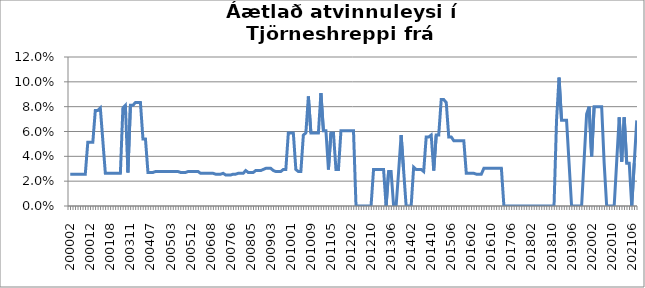
| Category | Series 0 |
|---|---|
| 200002 | 0.026 |
| 200003 | 0.026 |
| 200004 | 0.026 |
| 200005 | 0.026 |
| 200008 | 0.026 |
| 200009 | 0.026 |
| 200010 | 0.026 |
| 200011 | 0.051 |
| 200012 | 0.051 |
| 200101 | 0.051 |
| 200102 | 0.077 |
| 200103 | 0.077 |
| 200104 | 0.079 |
| 200105 | 0.053 |
| 200106 | 0.026 |
| 200107 | 0.026 |
| 200108 | 0.026 |
| 200110 | 0.026 |
| 200111 | 0.026 |
| 200201 | 0.026 |
| 200202 | 0.026 |
| 200302 | 0.079 |
| 200303 | 0.081 |
| 200307 | 0.027 |
| 200311 | 0.081 |
| 200312 | 0.081 |
| 200401 | 0.083 |
| 200402 | 0.083 |
| 200403 | 0.083 |
| 200404 | 0.054 |
| 200405 | 0.054 |
| 200406 | 0.027 |
| 200407 | 0.027 |
| 200408 | 0.027 |
| 200409 | 0.028 |
| 200410 | 0.028 |
| 200411 | 0.028 |
| 200412 | 0.028 |
| 200501 | 0.028 |
| 200502 | 0.028 |
| 200503 | 0.028 |
| 200504 | 0.028 |
| 200505 | 0.028 |
| 200506 | 0.028 |
| 200507 | 0.027 |
| 200508 | 0.027 |
| 200509 | 0.027 |
| 200510 | 0.028 |
| 200512 | 0.028 |
| 200601 | 0.028 |
| 200602 | 0.028 |
| 200603 | 0.028 |
| 200604 | 0.026 |
| 200605 | 0.026 |
| 200606 | 0.026 |
| 200607 | 0.026 |
| 200608 | 0.026 |
| 200609 | 0.026 |
| 200610 | 0.026 |
| 200611 | 0.026 |
| 200612 | 0.026 |
| 200703 | 0.026 |
| 200704 | 0.025 |
| 200705 | 0.025 |
| 200706 | 0.025 |
| 200707 | 0.026 |
| 200709 | 0.026 |
| 200710 | 0.026 |
| 200711 | 0.026 |
| 200801 | 0.026 |
| 200803 | 0.029 |
| 200804 | 0.027 |
| 200805 | 0.027 |
| 200806 | 0.027 |
| 200807 | 0.029 |
| 200808 | 0.029 |
| 200809 | 0.029 |
| 200810 | 0.029 |
| 200901 | 0.03 |
| 200902 | 0.03 |
| 200903 | 0.03 |
| 200905 | 0.029 |
| 200907 | 0.028 |
| 200908 | 0.028 |
| 200909 | 0.028 |
| 200910 | 0.029 |
| 200911 | 0.029 |
| 200912 | 0.059 |
| 201001 | 0.059 |
| 201002 | 0.059 |
| 201003 | 0.029 |
| 201004 | 0.028 |
| 201005 | 0.028 |
| 201006 | 0.057 |
| 201007 | 0.059 |
| 201008 | 0.088 |
| 201009 | 0.059 |
| 201010 | 0.059 |
| 201011 | 0.059 |
| 201012 | 0.059 |
| 201101 | 0.091 |
| 201102 | 0.061 |
| 201103 | 0.061 |
| 201104 | 0.029 |
| 201105 | 0.059 |
| 201106 | 0.059 |
| 201107 | 0.029 |
| 201108 | 0.029 |
| 201110 | 0.061 |
| 201111 | 0.061 |
| 201112 | 0.061 |
| 201201 | 0.061 |
| 201202 | 0.061 |
| 201203 | 0.061 |
| 201204 | 0 |
| 201205 | 0 |
| 201206 | 0 |
| 201207 | 0 |
| 201208 | 0 |
| 201209 | 0 |
| 201210 | 0 |
| 201211 | 0.029 |
| 201212 | 0.029 |
| 201301 | 0.029 |
| 201302 | 0.029 |
| 201303 | 0.029 |
| 201304 | 0 |
| 201305 | 0.028 |
| 201306 | 0.028 |
| 201307 | 0 |
| 201308 | 0 |
| 201309 | 0.028 |
| 201310 | 0.057 |
| 201311 | 0.029 |
| 201312 | 0 |
| 201401 | 0 |
| 201402 | 0 |
| 201403 | 0.031 |
| 201404 | 0.029 |
| 201405 | 0.029 |
| 201406 | 0.029 |
| 201407 | 0.028 |
| 201408 | 0.056 |
| 201409 | 0.056 |
| 201410 | 0.057 |
| 201411 | 0.029 |
| 201412 | 0.057 |
| 201501 | 0.057 |
| 201502 | 0.086 |
| 201503 | 0.086 |
| 201504 | 0.083 |
| 201505 | 0.056 |
| 201506 | 0.056 |
| 201507 | 0.053 |
| 201508 | 0.053 |
| 201509 | 0.053 |
| 201510 | 0.053 |
| 201511 | 0.053 |
| 201512 | 0.026 |
| 201601 | 0.026 |
| 201602 | 0.026 |
| 201603 | 0.026 |
| 201604 | 0.026 |
| 201605 | 0.026 |
| 201606 | 0.026 |
| 201607 | 0.03 |
| 201608 | 0.03 |
| 201609 | 0.03 |
| 201610 | 0.03 |
| 201611 | 0.03 |
| 201612 | 0.03 |
| 201701 | 0.03 |
| 201702 | 0.03 |
| 201703 | 0 |
| 201704 | 0 |
| 201705 | 0 |
| 201706 | 0 |
| 201707 | 0 |
| 201708 | 0 |
| 201709 | 0 |
| 201710 | 0 |
| 201711 | 0 |
| 201712 | 0 |
| 201801 | 0 |
| 201802 | 0 |
| 201803 | 0 |
| 201804 | 0 |
| 201805 | 0 |
| 201806 | 0 |
| 201807 | 0 |
| 201808 | 0 |
| 201809 | 0 |
| 201810 | 0 |
| 201811 | 0 |
| 201812 | 0.069 |
| 201901 | 0.103 |
| 201902 | 0.069 |
| 201903 | 0.069 |
| 201904 | 0.069 |
| 201905 | 0.034 |
| 201906 | 0 |
| 201907 | 0 |
| 201908 | 0 |
| 201909 | 0 |
| 201910 | 0 |
| 201911 | 0.037 |
| 201912 | 0.074 |
| 202001 | 0.08 |
| 202002 | 0.04 |
| 202003 | 0.08 |
| 202004 | 0.08 |
| 202005 | 0.08 |
| 202006 | 0.08 |
| 202007 | 0.034 |
| 202008 | 0 |
| 202009 | 0 |
| 202010 | 0 |
| 202011 | 0 |
| 202012 | 0.036 |
| 202101 | 0.071 |
| 202102 | 0.036 |
| 202103 | 0.071 |
| 202104 | 0.034 |
| 202105 | 0.034 |
| 202106 | 0 |
| 202107 | 0.034 |
| 202108 | 0.069 |